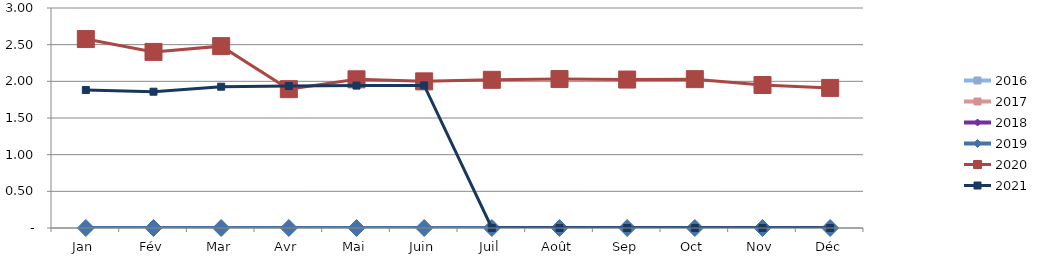
| Category | 2015 | 2016 | 2017 | 2018 | 2019 | 2020 | 2021 |
|---|---|---|---|---|---|---|---|
| Jan |  | 0 | 0 | 0 | 0 | 2.576 | 1.881 |
| Fév |  | 0 | 0 | 0 | 0 | 2.401 | 1.858 |
| Mar |  | 0 | 0 | 0 | 0 | 2.48 | 1.927 |
| Avr |  | 0 | 0 | 0 | 0 | 1.893 | 1.936 |
| Mai |  | 0 | 0 | 0 | 0 | 2.028 | 1.942 |
| Juin |  | 0 | 0 | 0 | 0 | 2 | 1.945 |
| Juil |  | 0 | 0 | 0 | 0 | 2.021 | 0 |
| Août |  | 0 | 0 | 0 | 0 | 2.031 | 0 |
| Sep |  | 0 | 0 | 0 | 0 | 2.024 | 0 |
| Oct |  | 0 | 0 | 0 | 0 | 2.03 | 0 |
| Nov |  | 0 | 0 | 0 | 0 | 1.95 | 0 |
| Déc |  | 0 | 0 | 0 | 0 | 1.91 | 0 |